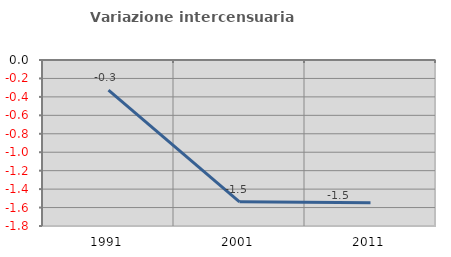
| Category | Variazione intercensuaria annua |
|---|---|
| 1991.0 | -0.326 |
| 2001.0 | -1.538 |
| 2011.0 | -1.549 |